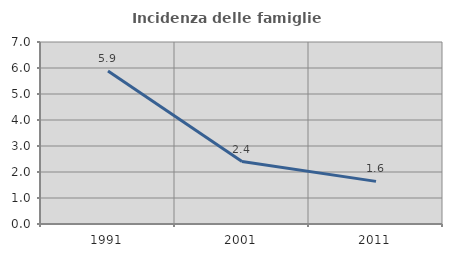
| Category | Incidenza delle famiglie numerose |
|---|---|
| 1991.0 | 5.882 |
| 2001.0 | 2.4 |
| 2011.0 | 1.639 |